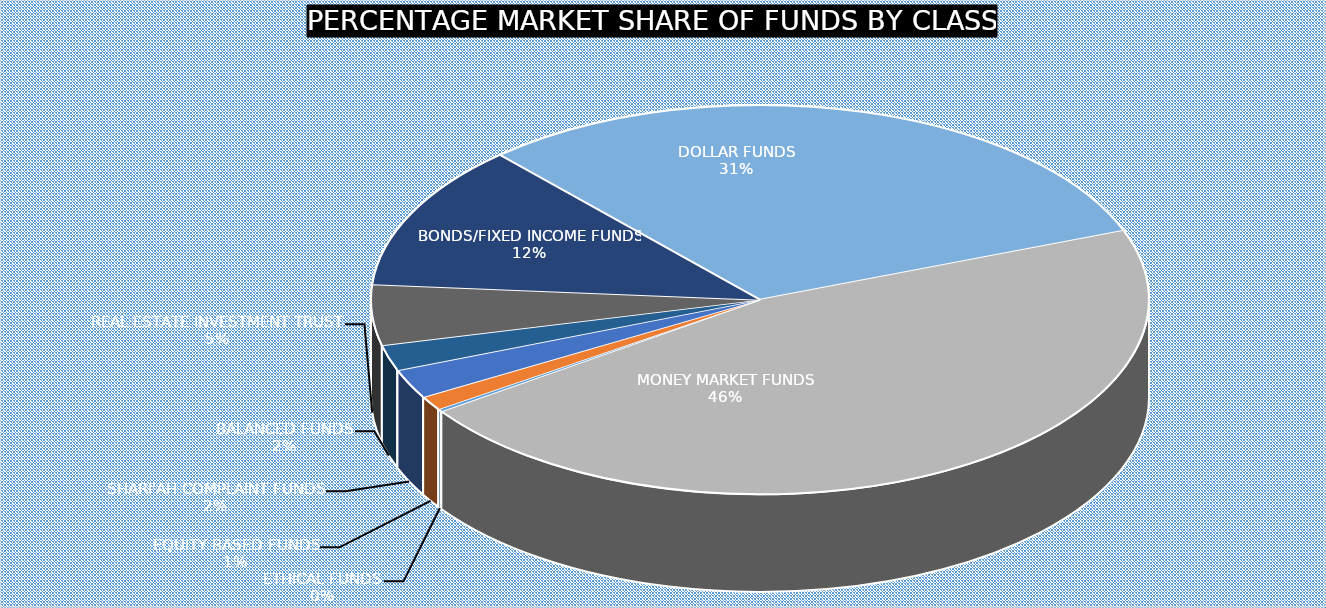
| Category | August 2023 |
|---|---|
| ETHICAL FUNDS | 3883826302.55 |
| EQUITY BASED FUNDS | 21743603431.12 |
| SHARI'AH COMPLAINT FUNDS | 45094809998.37 |
| BALANCED FUNDS | 39333970363.31 |
| REAL ESTATE INVESTMENT TRUST | 93090595814.18 |
| BONDS/FIXED INCOME FUNDS | 223790317567.7 |
| DOLLAR FUNDS | 572006206063.628 |
| MONEY MARKET FUNDS | 851855178919.605 |